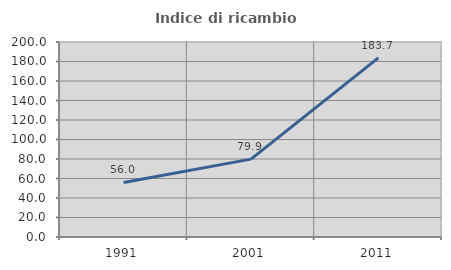
| Category | Indice di ricambio occupazionale  |
|---|---|
| 1991.0 | 55.991 |
| 2001.0 | 79.856 |
| 2011.0 | 183.673 |